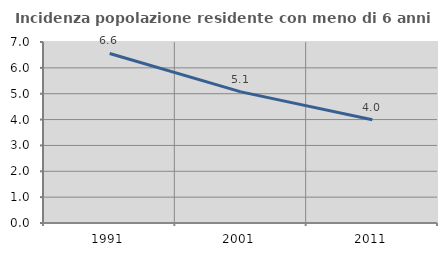
| Category | Incidenza popolazione residente con meno di 6 anni |
|---|---|
| 1991.0 | 6.557 |
| 2001.0 | 5.072 |
| 2011.0 | 3.992 |